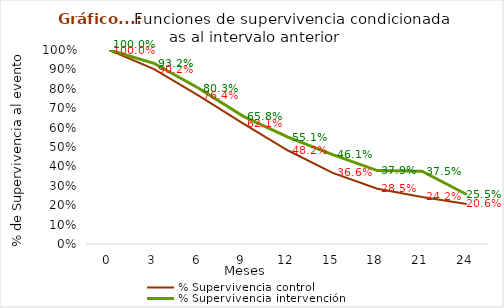
| Category | % Supervivencia control | % Supervivencia intervención |
|---|---|---|
| 0.0 | 1 | 1 |
| 3.0 | 0.902 | 0.932 |
| 6.0 | 0.764 | 0.803 |
| 9.0 | 0.621 | 0.658 |
| 12.0 | 0.482 | 0.551 |
| 15.0 | 0.366 | 0.461 |
| 18.0 | 0.285 | 0.379 |
| 21.0 | 0.242 | 0.375 |
| 24.0 | 0.206 | 0.255 |